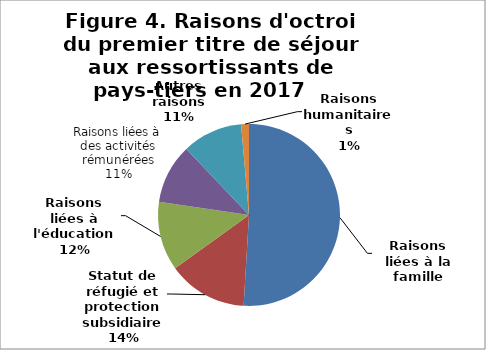
| Category | Series 0 |
|---|---|
| Raisons liées à la famille | 28653 |
| Statut de réfugié et protection subsidiaire | 7951 |
| Raisons liées à l'éducation | 6896 |
| Raisons liées à des activités rémunérées | 5948 |
| Autres raisons | 6014 |
| Raisons humanitaires | 784 |